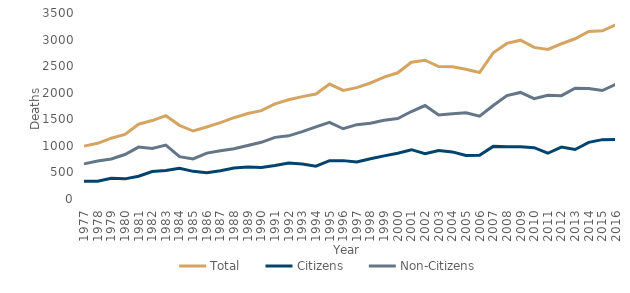
| Category | Total | Citizens | Non-Citizens   |
|---|---|---|---|
| 1977.0 | 995 | 334 | 661 |
| 1978.0 | 1048 | 334 | 714 |
| 1979.0 | 1144 | 392 | 752 |
| 1980.0 | 1216 | 379 | 837 |
| 1981.0 | 1407 | 429 | 977 |
| 1982.0 | 1476 | 516 | 952 |
| 1983.0 | 1568 | 538 | 1015 |
| 1984.0 | 1386 | 578 | 796 |
| 1985.0 | 1279 | 520 | 755 |
| 1986.0 | 1356 | 492 | 864 |
| 1987.0 | 1437 | 531 | 906 |
| 1988.0 | 1530 | 585 | 945 |
| 1989.0 | 1609 | 602 | 1007 |
| 1990.0 | 1662 | 595 | 1067 |
| 1991.0 | 1791 | 631 | 1160 |
| 1992.0 | 1868 | 679 | 1189 |
| 1993.0 | 1927 | 660 | 1267 |
| 1994.0 | 1976 | 618 | 1358 |
| 1995.0 | 2163 | 721 | 1442 |
| 1996.0 | 2044 | 722 | 1322 |
| 1997.0 | 2095 | 696 | 1399 |
| 1998.0 | 2183 | 757 | 1426 |
| 1999.0 | 2295 | 812 | 1483 |
| 2000.0 | 2375 | 861 | 1514 |
| 2001.0 | 2574 | 928 | 1646 |
| 2002.0 | 2612 | 853 | 1759 |
| 2003.0 | 2493 | 913 | 1580 |
| 2004.0 | 2489 | 886 | 1603 |
| 2005.0 | 2443 | 819 | 1624 |
| 2006.0 | 2380 | 821 | 1559 |
| 2007.0 | 2750 | 990 | 1760 |
| 2008.0 | 2928 | 981 | 1947 |
| 2009.0 | 2988 | 983 | 2005 |
| 2010.0 | 2853 | 965 | 1888 |
| 2011.0 | 2814 | 861 | 1953 |
| 2012.0 | 2921 | 976 | 1945 |
| 2013.0 | 3015 | 932 | 2083 |
| 2014.0 | 3153 | 1065 | 2080 |
| 2015.0 | 3164 | 1117 | 2041 |
| 2016.0 | 3282 | 1120 | 2160 |